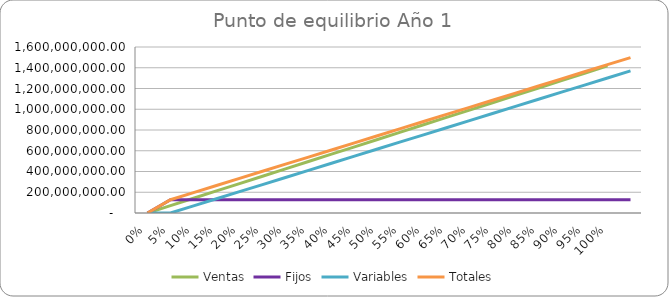
| Category | Ventas | Fijos | Variables | Totales |
|---|---|---|---|---|
| 0.0 | 0 | 0 | 0 | 0 |
| 0.05 | 70875000 | 128153530.928 | 0 | 128153530.928 |
| 0.1 | 141750000 | 128153530.928 | 68495949.848 | 196649480.775 |
| 0.15 | 212625000 | 128153530.928 | 136991899.695 | 265145430.623 |
| 0.2 | 283500000 | 128153530.928 | 205487849.543 | 333641380.47 |
| 0.25 | 354375000 | 128153530.928 | 273983799.39 | 402137330.318 |
| 0.3 | 425250000 | 128153530.928 | 342479749.238 | 470633280.165 |
| 0.35 | 496125000 | 128153530.928 | 410975699.085 | 539129230.013 |
| 0.4 | 567000000 | 128153530.928 | 479471648.933 | 607625179.86 |
| 0.45 | 637875000 | 128153530.928 | 547967598.78 | 676121129.708 |
| 0.5 | 708750000 | 128153530.928 | 616463548.628 | 744617079.555 |
| 0.55 | 779625000 | 128153530.928 | 684959498.475 | 813113029.403 |
| 0.6 | 850500000 | 128153530.928 | 753455448.323 | 881608979.25 |
| 0.65 | 921375000 | 128153530.928 | 821951398.17 | 950104929.098 |
| 0.7 | 992250000 | 128153530.928 | 890447348.018 | 1018600878.945 |
| 0.75 | 1063125000 | 128153530.928 | 958943297.865 | 1087096828.793 |
| 0.8 | 1134000000 | 128153530.928 | 1027439247.713 | 1155592778.64 |
| 0.85 | 1204875000 | 128153530.928 | 1095935197.56 | 1224088728.488 |
| 0.9 | 1275750000 | 128153530.928 | 1164431147.408 | 1292584678.335 |
| 0.95 | 1346625000 | 128153530.928 | 1232927097.255 | 1361080628.183 |
| 1.0 | 1417500000 | 128153530.928 | 1301423047.103 | 1429576578.03 |